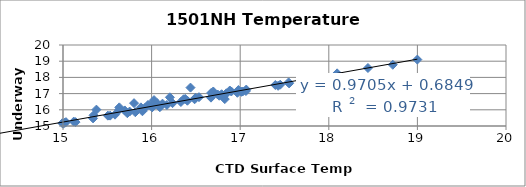
| Category | Temp |
|---|---|
| 16.7469 | 16.94 |
| 16.6723 | 17.04 |
| 16.1729 | 16.3 |
| 17.5523 | 17.63 |
| 17.7168 | 17.87 |
| 17.5462 | 17.69 |
| 18.4421 | 18.58 |
| 18.9992 | 19.1 |
| 18.722 | 18.78 |
| 17.7656 | 17.88 |
| 17.6877 | 17.85 |
| 18.0939 | 18.25 |
| 17.4517 | 17.55 |
| 17.4278 | 17.48 |
| 17.0146 | 17.11 |
| 16.0069 | 16.15 |
| 16.8263 | 16.91 |
| 17.028 | 17.13 |
| 16.8995 | 17.13 |
| 16.5347 | 16.78 |
| 16.4854 | 16.65 |
| 16.4041 | 16.56 |
| 16.8261 | 16.66 |
| 16.6702 | 16.75 |
| 16.7641 | 16.87 |
| 16.8825 | 17.19 |
| 16.439 | 17.37 |
| 15.6351 | 16.01 |
| 16.7967 | 16.89 |
| 16.7903 | 16.96 |
| 16.9799 | 17.22 |
| 17.0648 | 17.16 |
| 16.9681 | 17.05 |
| 17.7279 | 17.82 |
| 17.0686 | 17.25 |
| 16.6961 | 17.13 |
| 17.3966 | 17.53 |
| 16.2364 | 16.41 |
| 15.6974 | 15.96 |
| 15.3769 | 16.01 |
| 16.0615 | 16.41 |
| 16.4962 | 16.74 |
| 15.6356 | 16.15 |
| 15.9828 | 16.29 |
| 15.8018 | 16.41 |
| 16.2064 | 16.77 |
| 16.3796 | 16.67 |
| 16.3613 | 16.65 |
| 15.8793 | 16.15 |
| 16.1232 | 16.38 |
| 15.3449 | 15.66 |
| 16.0276 | 16.6 |
| 15.9597 | 16.3 |
| 16.8445 | 17.02 |
| 16.3306 | 16.48 |
| 15.9252 | 16.11 |
| 15.8161 | 15.85 |
| 15.7517 | 15.89 |
| 15.587 | 15.7 |
| 15.5322 | 15.64 |
| 15.3395 | 15.47 |
| 14.8896 | 15.09 |
| 14.784 | 15.06 |
| 14.9925 | 15.17 |
| 15.0024 | 15.14 |
| 15.1211 | 15.27 |
| 15.0336 | 15.24 |
| 16.0927 | 16.16 |
| 15.8965 | 15.91 |
| 15.5065 | 15.64 |
| 14.4411 | 14.64 |
| 14.8348 | 15.04 |
| 15.0192 | 15.2 |
| 14.464 | 14.55 |
| 14.6514 | 14.74 |
| 14.8062 | 14.94 |
| 15.1412 | 15.24 |
| 15.7259 | 15.79 |
| 14.7682 | 15.86 |
| 14.544 | 14.82 |
| 14.6968 | 14.84 |
| 13.9056 | 14.09 |
| 14.806 | 14.89 |
| 14.6062 | 14.78 |
| 13.8001 | 14.04 |
| 13.9125 | 14 |